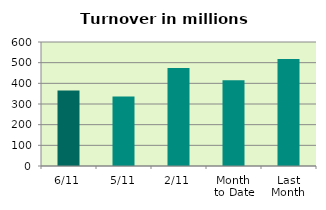
| Category | Series 0 |
|---|---|
| 6/11 | 365.818 |
| 5/11 | 336.17 |
| 2/11 | 474.246 |
| Month 
to Date | 414.568 |
| Last
Month | 517.71 |